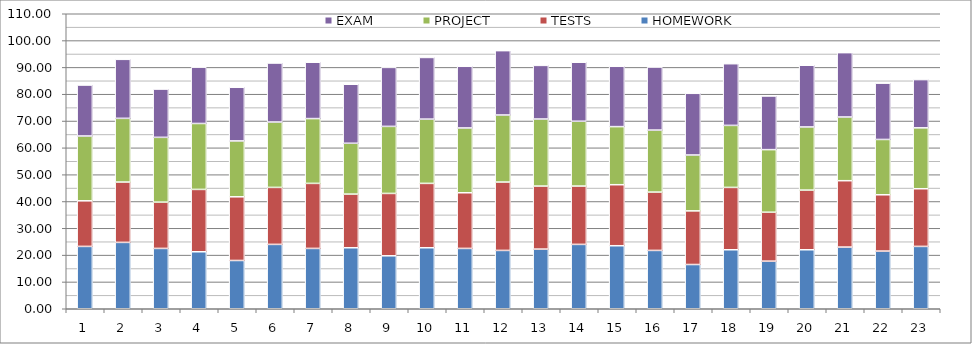
| Category | HOMEWORK | TESTS | PROJECT | EXAM |
|---|---|---|---|---|
| 0 | 23.25 | 17 | 24.167 | 19 |
| 1 | 24.75 | 22.5 | 23.75 | 22 |
| 2 | 22.5 | 17.25 | 24.167 | 18 |
| 3 | 21.25 | 23.25 | 24.583 | 21 |
| 4 | 18 | 23.75 | 20.833 | 20 |
| 5 | 24 | 21.25 | 24.375 | 22 |
| 6 | 22.5 | 24.25 | 24.167 | 21 |
| 7 | 22.75 | 20 | 18.958 | 22 |
| 8 | 19.75 | 23.25 | 25 | 22 |
| 9 | 22.75 | 24 | 23.958 | 23 |
| 10 | 22.5 | 20.75 | 24.167 | 23 |
| 11 | 21.75 | 25.5 | 25 | 24 |
| 12 | 22.25 | 23.5 | 25 | 20 |
| 13 | 24 | 21.75 | 24.167 | 22 |
| 14 | 23.5 | 22.75 | 21.667 | 22.5 |
| 15 | 21.75 | 21.75 | 23.125 | 23.5 |
| 16 | 16.5 | 20 | 20.833 | 23 |
| 17 | 22 | 23.25 | 23.125 | 23 |
| 18 | 17.75 | 18.25 | 23.333 | 20 |
| 19 | 22 | 22.25 | 23.542 | 23 |
| 20 | 23 | 24.75 | 23.75 | 24 |
| 21 | 21.5 | 21 | 20.625 | 21 |
| 22 | 23.25 | 21.5 | 22.708 | 18 |